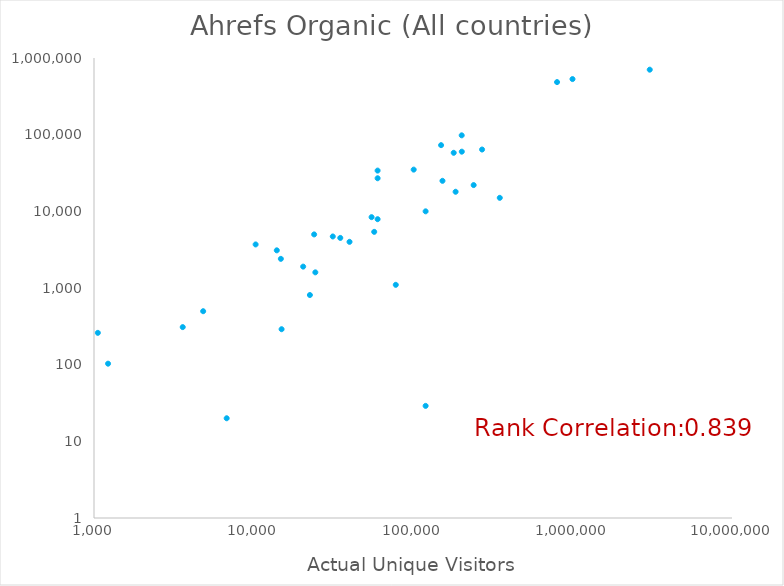
| Category | Ahrefs Organic (All countries) |
|---|---|
| 57127.0 | 5400 |
| 14843.0 | 2400 |
| 120000.0 | 10000 |
| 24000.0 | 5000 |
| 3600.0 | 309 |
| 150000.0 | 73000 |
| 185000.0 | 18000 |
| 240080.0 | 22000 |
| 31412.0 | 4700 |
| 22569.0 | 810 |
| 153037.0 | 25000 |
| 78000.0 | 1100 |
| 202000.0 | 98000 |
| 24417.0 | 1600 |
| 60000.0 | 7900 |
| 35000.0 | 4500 |
| 1000000.0 | 531000 |
| 350000.0 | 15000 |
| 20485.0 | 1900 |
| 271059.0 | 64000 |
| 101000.0 | 35000 |
| 800000.0 | 485000 |
| 60000.0 | 27000 |
| 180000.0 | 58000 |
| 15000.0 | 290 |
| 14000.0 | 3100 |
| 55000.0 | 8400 |
| 1057.0 | 260 |
| 10313.0 | 3700 |
| 1225.0 | 103 |
| 60000.0 | 34000 |
| 6790.0 | 20 |
| 202310.0 | 60000 |
| 40000.0 | 4000 |
| 120000.0 | 29 |
| 3050000.0 | 704000 |
| 4835.0 | 498 |